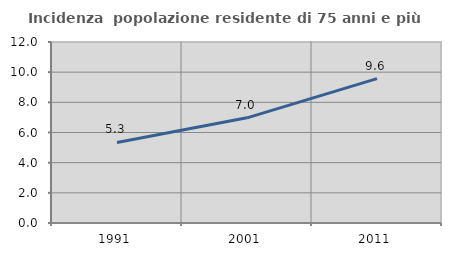
| Category | Incidenza  popolazione residente di 75 anni e più |
|---|---|
| 1991.0 | 5.34 |
| 2001.0 | 6.974 |
| 2011.0 | 9.57 |